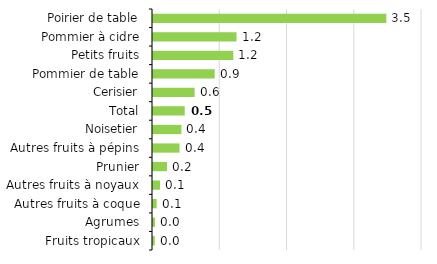
| Category | Series 0 |
|---|---|
| Fruits tropicaux | 0.026 |
| Agrumes | 0.029 |
| Autres fruits à coque | 0.055 |
| Autres fruits à noyaux | 0.104 |
| Prunier | 0.208 |
| Autres fruits à pépins | 0.394 |
| Noisetier | 0.422 |
| Total | 0.472 |
| Cerisier | 0.619 |
| Pommier de table | 0.918 |
| Petits fruits | 1.194 |
| Pommier à cidre | 1.243 |
| Poirier de table | 3.47 |